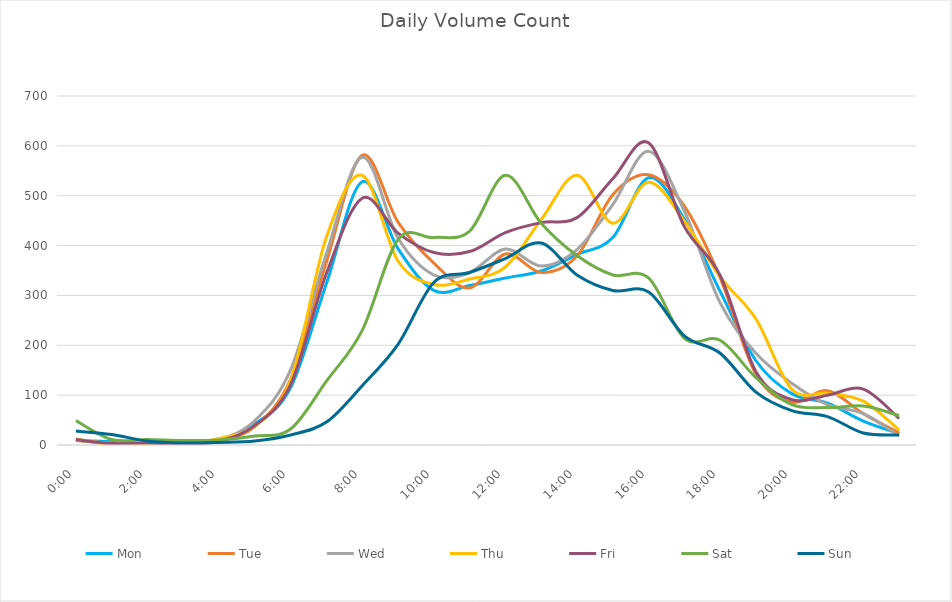
| Category | Mon | Tue | Wed | Thu | Fri | Sat | Sun |
|---|---|---|---|---|---|---|---|
| 0.0 | 9 | 9 | 10 | 12 | 11 | 49 | 28 |
| 0.0416666666666667 | 7 | 4 | 3 | 1 | 3 | 11 | 21 |
| 0.0833333333333333 | 3 | 2 | 1 | 1 | 4 | 11 | 8 |
| 0.125 | 5 | 1 | 7 | 2 | 1 | 9 | 4 |
| 0.166666666666667 | 7 | 9 | 11 | 13 | 8 | 10 | 5 |
| 0.208333333333333 | 42 | 37 | 49 | 38 | 39 | 18 | 8 |
| 0.25 | 115 | 132 | 151 | 130 | 121 | 32 | 20 |
| 0.291666666666667 | 324 | 367 | 384 | 417 | 344 | 128 | 46 |
| 0.333333333333333 | 528 | 581 | 577 | 541 | 495 | 230 | 119 |
| 0.375 | 394 | 447 | 415 | 369 | 425 | 412 | 202 |
| 0.416666666666667 | 310 | 365 | 341 | 322 | 386 | 416 | 326 |
| 0.4583333333333333 | 320 | 315 | 346 | 333 | 388 | 429 | 346 |
| 0.5 | 335 | 383 | 393 | 357 | 426 | 541 | 374 |
| 0.541666666666667 | 349 | 346 | 359 | 452 | 446 | 445 | 405 |
| 0.5833333333333334 | 382 | 379 | 392 | 541 | 456 | 380 | 341 |
| 0.625 | 416 | 502 | 482 | 445 | 534 | 341 | 310 |
| 0.666666666666667 | 536 | 542 | 589 | 527 | 606 | 335 | 307 |
| 0.7083333333333334 | 453 | 479 | 469 | 449 | 438 | 214 | 219 |
| 0.75 | 308 | 335 | 285 | 337 | 340 | 210 | 184 |
| 0.791666666666667 | 169 | 142 | 184 | 253 | 147 | 135 | 106 |
| 0.8333333333333334 | 103 | 86 | 124 | 112 | 91 | 81 | 69 |
| 0.875 | 84 | 109 | 81 | 104 | 100 | 75 | 57 |
| 0.916666666666667 | 48 | 63 | 63 | 88 | 112 | 78 | 24 |
| 0.9583333333333334 | 23 | 24 | 18 | 30 | 53 | 59 | 20 |